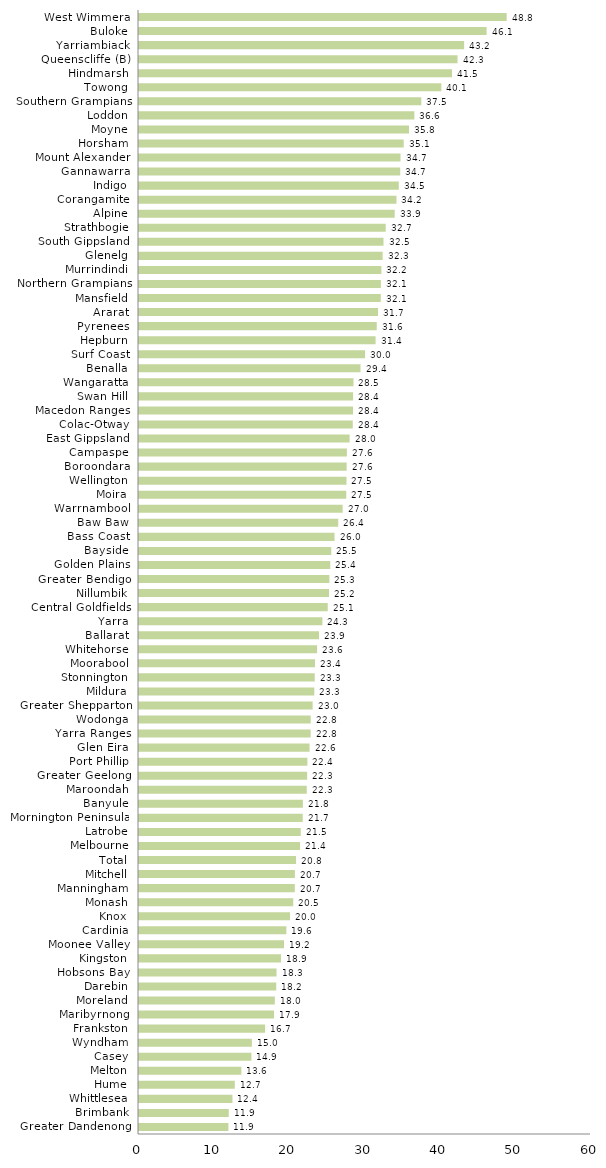
| Category | Series 0 |
|---|---|
| Greater Dandenong | 11.869 |
| Brimbank | 11.913 |
| Whittlesea | 12.406 |
| Hume | 12.716 |
| Melton | 13.584 |
| Casey | 14.92 |
| Wyndham | 14.984 |
| Frankston | 16.741 |
| Maribyrnong | 17.925 |
| Moreland | 18.028 |
| Darebin | 18.213 |
| Hobsons Bay | 18.256 |
| Kingston | 18.856 |
| Moonee Valley | 19.246 |
| Cardinia | 19.56 |
| Knox | 20.048 |
| Monash | 20.477 |
| Manningham | 20.68 |
| Mitchell | 20.691 |
| Total | 20.848 |
| Melbourne | 21.382 |
| Latrobe | 21.473 |
| Mornington Peninsula | 21.732 |
| Banyule | 21.757 |
| Maroondah | 22.27 |
| Greater Geelong | 22.32 |
| Port Phillip | 22.351 |
| Glen Eira | 22.64 |
| Yarra Ranges | 22.785 |
| Wodonga | 22.797 |
| Greater Shepparton | 23.049 |
| Mildura | 23.271 |
| Stonnington | 23.328 |
| Moorabool | 23.365 |
| Whitehorse | 23.642 |
| Ballarat | 23.898 |
| Yarra | 24.342 |
| Central Goldfields | 25.056 |
| Nillumbik | 25.225 |
| Greater Bendigo | 25.272 |
| Golden Plains | 25.388 |
| Bayside | 25.523 |
| Bass Coast | 25.954 |
| Baw Baw | 26.443 |
| Warrnambool | 27.032 |
| Moira | 27.511 |
| Wellington | 27.543 |
| Boroondara | 27.563 |
| Campaspe | 27.597 |
| East Gippsland | 27.958 |
| Colac-Otway | 28.375 |
| Macedon Ranges | 28.409 |
| Swan Hill | 28.415 |
| Wangaratta | 28.47 |
| Benalla | 29.404 |
| Surf Coast | 30.013 |
| Hepburn | 31.403 |
| Pyrenees | 31.558 |
| Ararat | 31.727 |
| Mansfield | 32.097 |
| Northern Grampians | 32.108 |
| Murrindindi | 32.178 |
| Glenelg | 32.338 |
| South Gippsland | 32.456 |
| Strathbogie | 32.749 |
| Alpine | 33.944 |
| Corangamite | 34.179 |
| Indigo | 34.484 |
| Gannawarra | 34.673 |
| Mount Alexander | 34.716 |
| Horsham | 35.139 |
| Moyne | 35.843 |
| Loddon | 36.551 |
| Southern Grampians | 37.475 |
| Towong | 40.133 |
| Hindmarsh | 41.546 |
| Queenscliffe (B) | 42.282 |
| Yarriambiack | 43.159 |
| Buloke | 46.14 |
| West Wimmera | 48.806 |